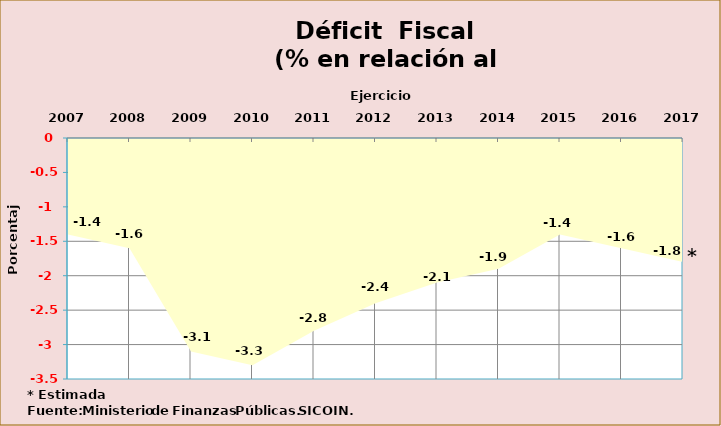
| Category | Series 0 |
|---|---|
| 2007 | -1.4 |
| 2008 | -1.6 |
| 2009 | -3.1 |
| 2010 | -3.3 |
| 2011 | -2.8 |
| 2012 | -2.4 |
| 2013 | -2.1 |
| 2014 | -1.9 |
| 2015 | -1.4 |
| 2016 | -1.6 |
| 2017 | -1.8 |